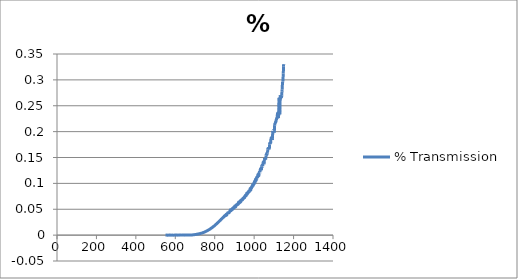
| Category | % Transmission |
|---|---|
| 1150.0 | 0.33 |
| 1149.0 | 0.327 |
| 1148.0 | 0.312 |
| 1147.0 | 0.306 |
| 1146.0 | 0.298 |
| 1145.0 | 0.297 |
| 1144.0 | 0.294 |
| 1143.0 | 0.289 |
| 1142.0 | 0.281 |
| 1141.0 | 0.278 |
| 1140.0 | 0.27 |
| 1139.0 | 0.266 |
| 1138.0 | 0.269 |
| 1137.0 | 0.267 |
| 1136.0 | 0.266 |
| 1135.0 | 0.265 |
| 1134.0 | 0.265 |
| 1133.0 | 0.27 |
| 1132.0 | 0.263 |
| 1131.0 | 0.243 |
| 1130.0 | 0.233 |
| 1129.0 | 0.241 |
| 1128.0 | 0.26 |
| 1127.0 | 0.266 |
| 1126.0 | 0.265 |
| 1125.0 | 0.247 |
| 1124.0 | 0.226 |
| 1123.0 | 0.226 |
| 1122.0 | 0.232 |
| 1121.0 | 0.232 |
| 1120.0 | 0.234 |
| 1119.0 | 0.236 |
| 1118.0 | 0.234 |
| 1117.0 | 0.228 |
| 1116.0 | 0.227 |
| 1115.0 | 0.227 |
| 1114.0 | 0.224 |
| 1113.0 | 0.224 |
| 1112.0 | 0.223 |
| 1111.0 | 0.22 |
| 1110.0 | 0.218 |
| 1109.0 | 0.22 |
| 1108.0 | 0.218 |
| 1107.0 | 0.216 |
| 1106.0 | 0.216 |
| 1105.0 | 0.215 |
| 1104.0 | 0.213 |
| 1103.0 | 0.202 |
| 1102.0 | 0.198 |
| 1101.0 | 0.198 |
| 1100.0 | 0.198 |
| 1099.0 | 0.201 |
| 1098.0 | 0.202 |
| 1097.0 | 0.202 |
| 1096.0 | 0.2 |
| 1095.0 | 0.201 |
| 1094.0 | 0.197 |
| 1093.0 | 0.186 |
| 1092.0 | 0.184 |
| 1091.0 | 0.187 |
| 1090.0 | 0.187 |
| 1089.0 | 0.188 |
| 1088.0 | 0.187 |
| 1087.0 | 0.188 |
| 1086.0 | 0.188 |
| 1085.0 | 0.186 |
| 1084.0 | 0.178 |
| 1083.0 | 0.176 |
| 1082.0 | 0.176 |
| 1081.0 | 0.177 |
| 1080.0 | 0.177 |
| 1079.0 | 0.178 |
| 1078.0 | 0.175 |
| 1077.0 | 0.165 |
| 1076.0 | 0.166 |
| 1075.0 | 0.166 |
| 1074.0 | 0.167 |
| 1073.0 | 0.168 |
| 1072.0 | 0.167 |
| 1071.0 | 0.168 |
| 1070.0 | 0.167 |
| 1069.0 | 0.166 |
| 1068.0 | 0.159 |
| 1067.0 | 0.158 |
| 1066.0 | 0.157 |
| 1065.0 | 0.156 |
| 1064.0 | 0.158 |
| 1063.0 | 0.157 |
| 1062.0 | 0.155 |
| 1061.0 | 0.155 |
| 1060.0 | 0.154 |
| 1059.0 | 0.147 |
| 1058.0 | 0.145 |
| 1057.0 | 0.146 |
| 1056.0 | 0.148 |
| 1055.0 | 0.148 |
| 1054.0 | 0.147 |
| 1053.0 | 0.149 |
| 1052.0 | 0.145 |
| 1051.0 | 0.139 |
| 1050.0 | 0.137 |
| 1049.0 | 0.14 |
| 1048.0 | 0.14 |
| 1047.0 | 0.141 |
| 1046.0 | 0.141 |
| 1045.0 | 0.139 |
| 1044.0 | 0.133 |
| 1043.0 | 0.133 |
| 1042.0 | 0.132 |
| 1041.0 | 0.133 |
| 1040.0 | 0.134 |
| 1039.0 | 0.134 |
| 1038.0 | 0.133 |
| 1037.0 | 0.126 |
| 1036.0 | 0.125 |
| 1035.0 | 0.126 |
| 1034.0 | 0.126 |
| 1033.0 | 0.127 |
| 1032.0 | 0.128 |
| 1031.0 | 0.127 |
| 1030.0 | 0.121 |
| 1029.0 | 0.121 |
| 1028.0 | 0.121 |
| 1027.0 | 0.121 |
| 1026.0 | 0.122 |
| 1025.0 | 0.12 |
| 1024.0 | 0.115 |
| 1023.0 | 0.115 |
| 1022.0 | 0.115 |
| 1021.0 | 0.116 |
| 1020.0 | 0.116 |
| 1019.0 | 0.117 |
| 1018.0 | 0.115 |
| 1017.0 | 0.11 |
| 1016.0 | 0.11 |
| 1015.0 | 0.111 |
| 1014.0 | 0.111 |
| 1013.0 | 0.112 |
| 1012.0 | 0.11 |
| 1011.0 | 0.106 |
| 1010.0 | 0.106 |
| 1009.0 | 0.106 |
| 1008.0 | 0.107 |
| 1007.0 | 0.108 |
| 1006.0 | 0.106 |
| 1005.0 | 0.102 |
| 1004.0 | 0.102 |
| 1003.0 | 0.104 |
| 1002.0 | 0.104 |
| 1001.0 | 0.102 |
| 1000.0 | 0.099 |
| 999.0 | 0.099 |
| 998.0 | 0.1 |
| 997.0 | 0.099 |
| 996.0 | 0.096 |
| 995.0 | 0.096 |
| 994.0 | 0.097 |
| 993.0 | 0.098 |
| 992.0 | 0.097 |
| 991.0 | 0.094 |
| 990.0 | 0.094 |
| 989.0 | 0.095 |
| 988.0 | 0.094 |
| 987.0 | 0.091 |
| 986.0 | 0.091 |
| 985.0 | 0.092 |
| 984.0 | 0.09 |
| 983.0 | 0.087 |
| 982.0 | 0.087 |
| 981.0 | 0.089 |
| 980.0 | 0.09 |
| 979.0 | 0.089 |
| 978.0 | 0.086 |
| 977.0 | 0.086 |
| 976.0 | 0.086 |
| 975.0 | 0.084 |
| 974.0 | 0.084 |
| 973.0 | 0.085 |
| 972.0 | 0.085 |
| 971.0 | 0.083 |
| 970.0 | 0.083 |
| 969.0 | 0.083 |
| 968.0 | 0.081 |
| 967.0 | 0.082 |
| 966.0 | 0.081 |
| 965.0 | 0.079 |
| 964.0 | 0.08 |
| 963.0 | 0.081 |
| 962.0 | 0.081 |
| 961.0 | 0.078 |
| 960.0 | 0.077 |
| 959.0 | 0.076 |
| 958.0 | 0.078 |
| 957.0 | 0.077 |
| 956.0 | 0.076 |
| 955.0 | 0.077 |
| 954.0 | 0.076 |
| 953.0 | 0.074 |
| 952.0 | 0.072 |
| 951.0 | 0.074 |
| 950.0 | 0.074 |
| 949.0 | 0.073 |
| 948.0 | 0.072 |
| 947.0 | 0.072 |
| 946.0 | 0.071 |
| 945.0 | 0.07 |
| 944.0 | 0.071 |
| 943.0 | 0.071 |
| 942.0 | 0.069 |
| 941.0 | 0.068 |
| 940.0 | 0.069 |
| 939.0 | 0.069 |
| 938.0 | 0.068 |
| 937.0 | 0.068 |
| 936.0 | 0.068 |
| 935.0 | 0.068 |
| 934.0 | 0.066 |
| 933.0 | 0.065 |
| 932.0 | 0.066 |
| 931.0 | 0.067 |
| 930.0 | 0.064 |
| 929.0 | 0.063 |
| 928.0 | 0.065 |
| 927.0 | 0.064 |
| 926.0 | 0.064 |
| 925.0 | 0.063 |
| 924.0 | 0.062 |
| 923.0 | 0.062 |
| 922.0 | 0.064 |
| 921.0 | 0.064 |
| 920.0 | 0.062 |
| 919.0 | 0.06 |
| 918.0 | 0.06 |
| 917.0 | 0.06 |
| 916.0 | 0.06 |
| 915.0 | 0.06 |
| 914.0 | 0.058 |
| 913.0 | 0.059 |
| 912.0 | 0.059 |
| 911.0 | 0.058 |
| 910.0 | 0.058 |
| 909.0 | 0.058 |
| 908.0 | 0.057 |
| 907.0 | 0.055 |
| 906.0 | 0.055 |
| 905.0 | 0.056 |
| 904.0 | 0.055 |
| 903.0 | 0.056 |
| 902.0 | 0.056 |
| 901.0 | 0.055 |
| 900.0 | 0.054 |
| 899.0 | 0.053 |
| 898.0 | 0.052 |
| 897.0 | 0.052 |
| 896.0 | 0.053 |
| 895.0 | 0.053 |
| 894.0 | 0.052 |
| 893.0 | 0.051 |
| 892.0 | 0.05 |
| 891.0 | 0.051 |
| 890.0 | 0.052 |
| 889.0 | 0.051 |
| 888.0 | 0.05 |
| 887.0 | 0.049 |
| 886.0 | 0.048 |
| 885.0 | 0.049 |
| 884.0 | 0.048 |
| 883.0 | 0.048 |
| 882.0 | 0.047 |
| 881.0 | 0.048 |
| 880.0 | 0.048 |
| 879.0 | 0.049 |
| 878.0 | 0.047 |
| 877.0 | 0.047 |
| 876.0 | 0.046 |
| 875.0 | 0.045 |
| 874.0 | 0.044 |
| 873.0 | 0.044 |
| 872.0 | 0.043 |
| 871.0 | 0.043 |
| 870.0 | 0.043 |
| 869.0 | 0.043 |
| 868.0 | 0.043 |
| 867.0 | 0.043 |
| 866.0 | 0.043 |
| 865.0 | 0.042 |
| 864.0 | 0.042 |
| 863.0 | 0.041 |
| 862.0 | 0.041 |
| 861.0 | 0.039 |
| 860.0 | 0.039 |
| 859.0 | 0.04 |
| 858.0 | 0.04 |
| 857.0 | 0.039 |
| 856.0 | 0.038 |
| 855.0 | 0.038 |
| 854.0 | 0.037 |
| 853.0 | 0.038 |
| 852.0 | 0.038 |
| 851.0 | 0.038 |
| 850.0 | 0.037 |
| 849.0 | 0.037 |
| 848.0 | 0.037 |
| 847.0 | 0.036 |
| 846.0 | 0.035 |
| 845.0 | 0.035 |
| 844.0 | 0.035 |
| 843.0 | 0.034 |
| 842.0 | 0.034 |
| 841.0 | 0.033 |
| 840.0 | 0.033 |
| 839.0 | 0.033 |
| 838.0 | 0.032 |
| 837.0 | 0.032 |
| 836.0 | 0.032 |
| 835.0 | 0.031 |
| 834.0 | 0.031 |
| 833.0 | 0.031 |
| 832.0 | 0.03 |
| 831.0 | 0.03 |
| 830.0 | 0.029 |
| 829.0 | 0.029 |
| 828.0 | 0.028 |
| 827.0 | 0.028 |
| 826.0 | 0.028 |
| 825.0 | 0.027 |
| 824.0 | 0.027 |
| 823.0 | 0.027 |
| 822.0 | 0.026 |
| 821.0 | 0.026 |
| 820.0 | 0.026 |
| 819.0 | 0.025 |
| 818.0 | 0.025 |
| 817.0 | 0.024 |
| 816.0 | 0.024 |
| 815.0 | 0.024 |
| 814.0 | 0.024 |
| 813.0 | 0.023 |
| 812.0 | 0.023 |
| 811.0 | 0.022 |
| 810.0 | 0.022 |
| 809.0 | 0.022 |
| 808.0 | 0.021 |
| 807.0 | 0.021 |
| 806.0 | 0.021 |
| 805.0 | 0.02 |
| 804.0 | 0.02 |
| 803.0 | 0.02 |
| 802.0 | 0.019 |
| 801.0 | 0.019 |
| 800.0 | 0.019 |
| 799.0 | 0.018 |
| 798.0 | 0.018 |
| 797.0 | 0.018 |
| 796.0 | 0.017 |
| 795.0 | 0.017 |
| 794.0 | 0.017 |
| 793.0 | 0.017 |
| 792.0 | 0.016 |
| 791.0 | 0.016 |
| 790.0 | 0.015 |
| 789.0 | 0.015 |
| 788.0 | 0.015 |
| 787.0 | 0.015 |
| 786.0 | 0.014 |
| 785.0 | 0.014 |
| 784.0 | 0.014 |
| 783.0 | 0.014 |
| 782.0 | 0.013 |
| 781.0 | 0.013 |
| 780.0 | 0.013 |
| 779.0 | 0.013 |
| 778.0 | 0.012 |
| 777.0 | 0.012 |
| 776.0 | 0.012 |
| 775.0 | 0.011 |
| 774.0 | 0.011 |
| 773.0 | 0.011 |
| 772.0 | 0.011 |
| 771.0 | 0.01 |
| 770.0 | 0.01 |
| 769.0 | 0.01 |
| 768.0 | 0.01 |
| 767.0 | 0.01 |
| 766.0 | 0.009 |
| 765.0 | 0.009 |
| 764.0 | 0.009 |
| 763.0 | 0.009 |
| 762.0 | 0.008 |
| 761.0 | 0.008 |
| 760.0 | 0.008 |
| 759.0 | 0.008 |
| 758.0 | 0.008 |
| 757.0 | 0.008 |
| 756.0 | 0.007 |
| 755.0 | 0.007 |
| 754.0 | 0.007 |
| 753.0 | 0.007 |
| 752.0 | 0.006 |
| 751.0 | 0.006 |
| 750.0 | 0.006 |
| 749.0 | 0.006 |
| 748.0 | 0.006 |
| 747.0 | 0.006 |
| 746.0 | 0.006 |
| 745.0 | 0.005 |
| 744.0 | 0.005 |
| 743.0 | 0.005 |
| 742.0 | 0.005 |
| 741.0 | 0.005 |
| 740.0 | 0.005 |
| 739.0 | 0.005 |
| 738.0 | 0.004 |
| 737.0 | 0.004 |
| 736.0 | 0.004 |
| 735.0 | 0.004 |
| 734.0 | 0.004 |
| 733.0 | 0.004 |
| 732.0 | 0.004 |
| 731.0 | 0.004 |
| 730.0 | 0.003 |
| 729.0 | 0.003 |
| 728.0 | 0.003 |
| 727.0 | 0.003 |
| 726.0 | 0.003 |
| 725.0 | 0.003 |
| 724.0 | 0.003 |
| 723.0 | 0.003 |
| 722.0 | 0.003 |
| 721.0 | 0.003 |
| 720.0 | 0.002 |
| 719.0 | 0.002 |
| 718.0 | 0.002 |
| 717.0 | 0.002 |
| 716.0 | 0.002 |
| 715.0 | 0.002 |
| 714.0 | 0.002 |
| 713.0 | 0.002 |
| 712.0 | 0.002 |
| 711.0 | 0.002 |
| 710.0 | 0.002 |
| 709.0 | 0.002 |
| 708.0 | 0.002 |
| 707.0 | 0.002 |
| 706.0 | 0.001 |
| 705.0 | 0.001 |
| 704.0 | 0.001 |
| 703.0 | 0.001 |
| 702.0 | 0.001 |
| 701.0 | 0.001 |
| 700.0 | 0.001 |
| 699.0 | 0.001 |
| 698.0 | 0.001 |
| 697.0 | 0.001 |
| 696.0 | 0.001 |
| 695.0 | 0.001 |
| 694.0 | 0.001 |
| 693.0 | 0.001 |
| 692.0 | 0.001 |
| 691.0 | 0.001 |
| 690.0 | 0.001 |
| 689.0 | 0.001 |
| 688.0 | 0 |
| 687.0 | 0 |
| 686.0 | 0 |
| 685.0 | 0 |
| 684.0 | 0 |
| 683.0 | 0 |
| 682.0 | 0 |
| 681.0 | 0 |
| 680.0 | 0 |
| 679.0 | 0 |
| 678.0 | 0 |
| 677.0 | 0 |
| 676.0 | 0 |
| 675.0 | 0 |
| 674.0 | 0 |
| 673.0 | 0 |
| 672.0 | 0 |
| 671.0 | 0 |
| 670.0 | 0 |
| 669.0 | 0 |
| 668.0 | 0 |
| 667.0 | 0 |
| 666.0 | 0 |
| 665.0 | 0 |
| 664.0 | 0 |
| 663.0 | 0 |
| 662.0 | 0 |
| 661.0 | 0 |
| 660.0 | 0 |
| 659.0 | 0 |
| 658.0 | 0 |
| 657.0 | 0 |
| 656.0 | 0 |
| 655.0 | 0 |
| 654.0 | 0 |
| 653.0 | 0 |
| 652.0 | 0 |
| 651.0 | 0 |
| 650.0 | 0 |
| 649.0 | 0 |
| 648.0 | 0 |
| 647.0 | 0 |
| 646.0 | 0 |
| 645.0 | 0 |
| 644.0 | 0 |
| 643.0 | 0 |
| 642.0 | 0 |
| 641.0 | 0 |
| 640.0 | 0 |
| 639.0 | 0 |
| 638.0 | 0 |
| 637.0 | 0 |
| 636.0 | 0 |
| 635.0 | 0 |
| 634.0 | 0 |
| 633.0 | 0 |
| 632.0 | 0 |
| 631.0 | 0 |
| 630.0 | 0 |
| 629.0 | 0 |
| 628.0 | 0 |
| 627.0 | 0 |
| 626.0 | 0 |
| 625.0 | 0 |
| 624.0 | 0 |
| 623.0 | 0 |
| 622.0 | 0 |
| 621.0 | 0 |
| 620.0 | 0 |
| 619.0 | 0 |
| 618.0 | 0 |
| 617.0 | 0 |
| 616.0 | 0 |
| 615.0 | 0 |
| 614.0 | 0 |
| 613.0 | 0 |
| 612.0 | 0 |
| 611.0 | 0 |
| 610.0 | 0 |
| 609.0 | 0 |
| 608.0 | 0 |
| 607.0 | 0 |
| 606.0 | 0 |
| 605.0 | 0 |
| 604.0 | 0 |
| 603.0 | 0 |
| 602.0 | 0 |
| 601.0 | 0 |
| 600.0 | 0 |
| 599.0 | 0 |
| 598.0 | 0 |
| 597.0 | 0 |
| 596.0 | 0 |
| 595.0 | 0 |
| 594.0 | 0 |
| 593.0 | 0 |
| 592.0 | 0 |
| 591.0 | 0 |
| 590.0 | 0 |
| 589.0 | 0 |
| 588.0 | 0 |
| 587.0 | 0 |
| 586.0 | 0 |
| 585.0 | 0 |
| 584.0 | 0 |
| 583.0 | 0 |
| 582.0 | 0 |
| 581.0 | 0 |
| 580.0 | 0 |
| 579.0 | 0 |
| 578.0 | 0 |
| 577.0 | 0 |
| 576.0 | 0 |
| 575.0 | 0 |
| 574.0 | 0 |
| 573.0 | 0 |
| 572.0 | 0 |
| 571.0 | 0 |
| 570.0 | 0 |
| 569.0 | 0 |
| 568.0 | 0 |
| 567.0 | 0 |
| 566.0 | 0 |
| 565.0 | 0 |
| 564.0 | 0 |
| 563.0 | 0 |
| 562.0 | 0 |
| 561.0 | 0 |
| 560.0 | 0 |
| 559.0 | 0 |
| 558.0 | 0 |
| 557.0 | 0 |
| 556.0 | 0 |
| 555.0 | 0 |
| 554.0 | 0 |
| 553.0 | 0 |
| 552.0 | 0 |
| 551.0 | 0 |
| 550.0 | 0 |